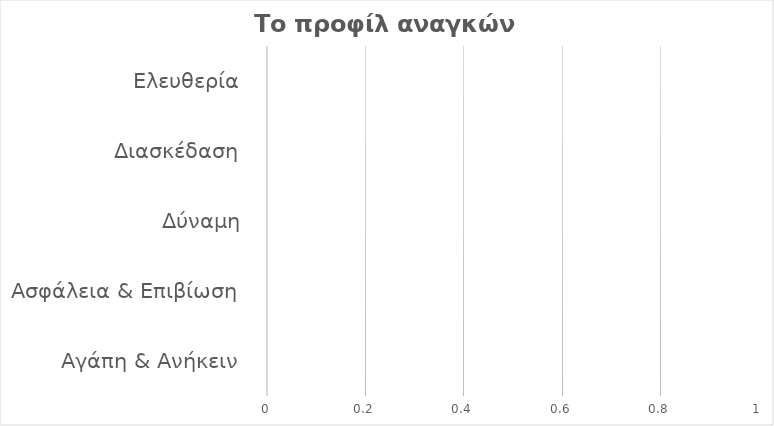
| Category | Series 0 |
|---|---|
| Αγάπη & Ανήκειν | 0 |
| Ασφάλεια & Επιβίωση | 0 |
| Δύναμη | 0 |
| Διασκέδαση | 0 |
| Ελευθερία | 0 |